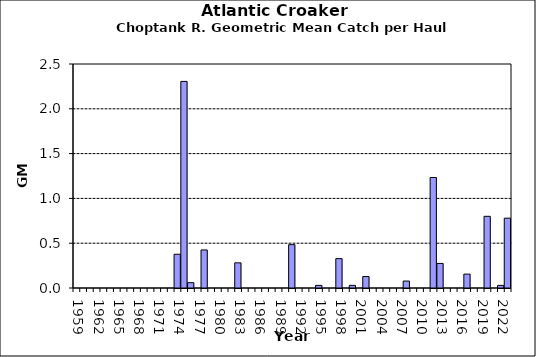
| Category | Series 0 |
|---|---|
| 1959.0 | 0 |
| 1960.0 | 0 |
| 1961.0 | 0 |
| 1962.0 | 0 |
| 1963.0 | 0 |
| 1964.0 | 0 |
| 1965.0 | 0 |
| 1966.0 | 0 |
| 1967.0 | 0 |
| 1968.0 | 0 |
| 1969.0 | 0 |
| 1970.0 | 0 |
| 1971.0 | 0 |
| 1972.0 | 0 |
| 1973.0 | 0 |
| 1974.0 | 0.377 |
| 1975.0 | 2.306 |
| 1976.0 | 0.059 |
| 1977.0 | 0 |
| 1978.0 | 0.425 |
| 1979.0 | 0 |
| 1980.0 | 0 |
| 1981.0 | 0 |
| 1982.0 | 0 |
| 1983.0 | 0.281 |
| 1984.0 | 0 |
| 1985.0 | 0 |
| 1986.0 | 0 |
| 1987.0 | 0 |
| 1988.0 | 0 |
| 1989.0 | 0 |
| 1990.0 | 0 |
| 1991.0 | 0.484 |
| 1992.0 | 0 |
| 1993.0 | 0 |
| 1994.0 | 0 |
| 1995.0 | 0.029 |
| 1996.0 | 0 |
| 1997.0 | 0 |
| 1998.0 | 0.328 |
| 1999.0 | 0 |
| 2000.0 | 0.029 |
| 2001.0 | 0 |
| 2002.0 | 0.128 |
| 2003.0 | 0 |
| 2004.0 | 0 |
| 2005.0 | 0 |
| 2006.0 | 0 |
| 2007.0 | 0 |
| 2008.0 | 0.078 |
| 2009.0 | 0 |
| 2010.0 | 0 |
| 2011.0 | 0 |
| 2012.0 | 1.233 |
| 2013.0 | 0.274 |
| 2014.0 | 0 |
| 2015.0 | 0 |
| 2016.0 | 0 |
| 2017.0 | 0.155 |
| 2018.0 | 0 |
| 2019.0 | 0 |
| 2020.0 | 0.8 |
| 2021.0 | 0 |
| 2022.0 | 0.029 |
| 2023.0 | 0.779 |